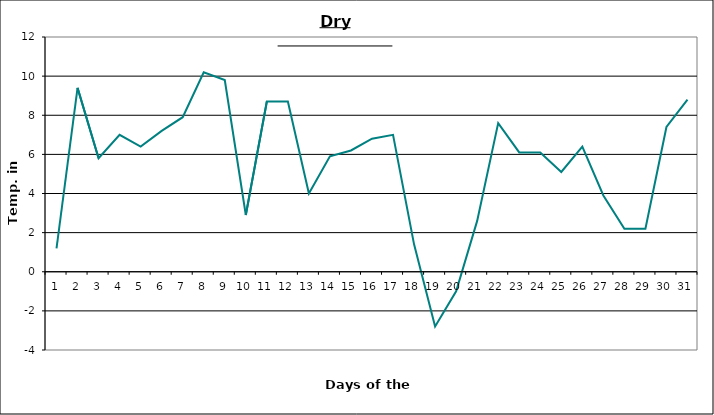
| Category | Series 0 |
|---|---|
| 0 | 1.2 |
| 1 | 9.4 |
| 2 | 5.8 |
| 3 | 7 |
| 4 | 6.4 |
| 5 | 7.2 |
| 6 | 7.9 |
| 7 | 10.2 |
| 8 | 9.8 |
| 9 | 2.9 |
| 10 | 8.7 |
| 11 | 8.7 |
| 12 | 4 |
| 13 | 5.9 |
| 14 | 6.2 |
| 15 | 6.8 |
| 16 | 7 |
| 17 | 1.4 |
| 18 | -2.8 |
| 19 | -1 |
| 20 | 2.6 |
| 21 | 7.6 |
| 22 | 6.1 |
| 23 | 6.1 |
| 24 | 5.1 |
| 25 | 6.4 |
| 26 | 3.9 |
| 27 | 2.2 |
| 28 | 2.2 |
| 29 | 7.4 |
| 30 | 8.8 |